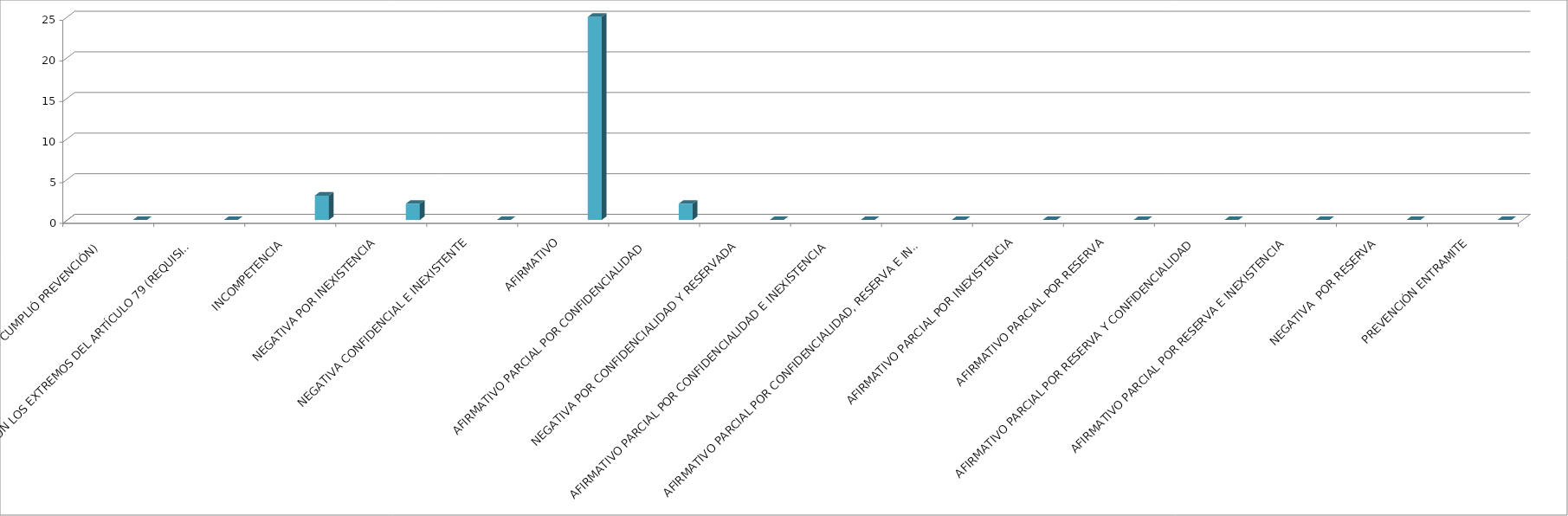
| Category | Series 0 | Series 1 | Series 2 | Series 3 | Series 4 |
|---|---|---|---|---|---|
| SE TIENE POR NO PRESENTADA ( NO CUMPLIÓ PREVENCIÓN) |  |  |  |  | 0 |
| NO CUMPLIO CON LOS EXTREMOS DEL ARTÍCULO 79 (REQUISITOS) |  |  |  |  | 0 |
| INCOMPETENCIA  |  |  |  |  | 3 |
| NEGATIVA POR INEXISTENCIA |  |  |  |  | 2 |
| NEGATIVA CONFIDENCIAL E INEXISTENTE |  |  |  |  | 0 |
| AFIRMATIVO |  |  |  |  | 25 |
| AFIRMATIVO PARCIAL POR CONFIDENCIALIDAD  |  |  |  |  | 2 |
| NEGATIVA POR CONFIDENCIALIDAD Y RESERVADA |  |  |  |  | 0 |
| AFIRMATIVO PARCIAL POR CONFIDENCIALIDAD E INEXISTENCIA |  |  |  |  | 0 |
| AFIRMATIVO PARCIAL POR CONFIDENCIALIDAD, RESERVA E INEXISTENCIA |  |  |  |  | 0 |
| AFIRMATIVO PARCIAL POR INEXISTENCIA |  |  |  |  | 0 |
| AFIRMATIVO PARCIAL POR RESERVA |  |  |  |  | 0 |
| AFIRMATIVO PARCIAL POR RESERVA Y CONFIDENCIALIDAD |  |  |  |  | 0 |
| AFIRMATIVO PARCIAL POR RESERVA E INEXISTENCIA |  |  |  |  | 0 |
| NEGATIVA  POR RESERVA |  |  |  |  | 0 |
| PREVENCIÓN ENTRAMITE |  |  |  |  | 0 |